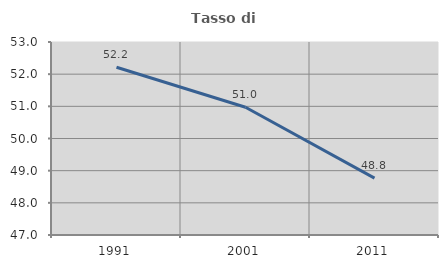
| Category | Tasso di occupazione   |
|---|---|
| 1991.0 | 52.215 |
| 2001.0 | 50.971 |
| 2011.0 | 48.768 |